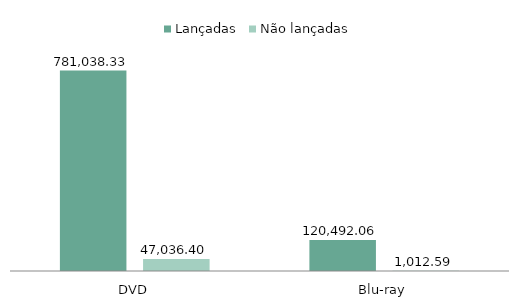
| Category | Lançadas | Não lançadas |
|---|---|---|
| DVD | 781038.33 | 47036.4 |
| Blu-ray | 120492.06 | 1012.59 |